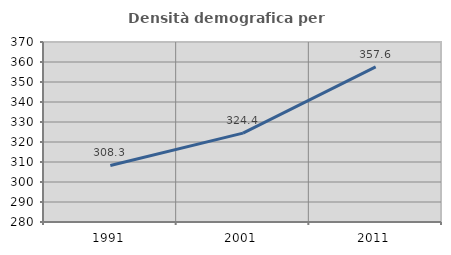
| Category | Densità demografica |
|---|---|
| 1991.0 | 308.274 |
| 2001.0 | 324.434 |
| 2011.0 | 357.552 |